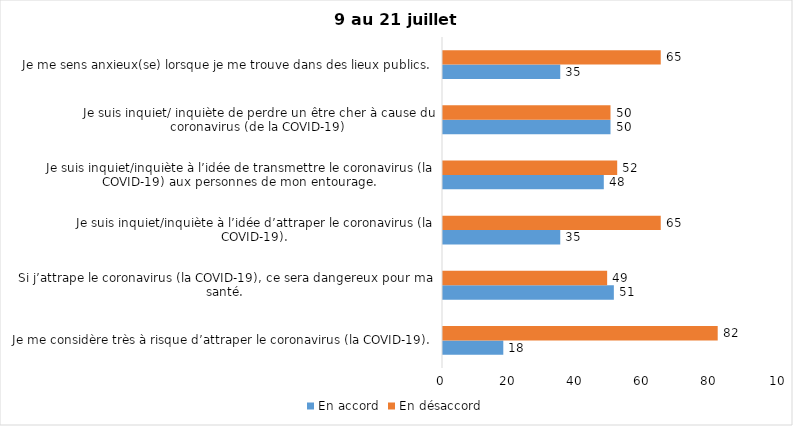
| Category | En accord | En désaccord |
|---|---|---|
| Je me considère très à risque d’attraper le coronavirus (la COVID-19). | 18 | 82 |
| Si j’attrape le coronavirus (la COVID-19), ce sera dangereux pour ma santé. | 51 | 49 |
| Je suis inquiet/inquiète à l’idée d’attraper le coronavirus (la COVID-19). | 35 | 65 |
| Je suis inquiet/inquiète à l’idée de transmettre le coronavirus (la COVID-19) aux personnes de mon entourage. | 48 | 52 |
| Je suis inquiet/ inquiète de perdre un être cher à cause du coronavirus (de la COVID-19) | 50 | 50 |
| Je me sens anxieux(se) lorsque je me trouve dans des lieux publics. | 35 | 65 |